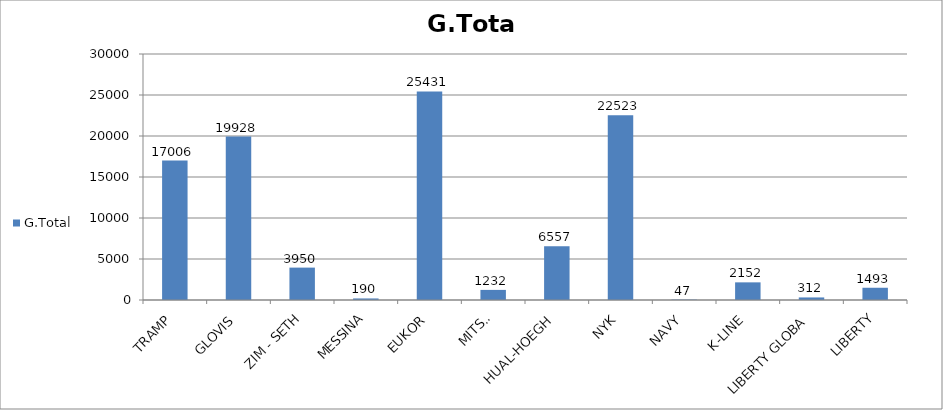
| Category | G.Total |
|---|---|
| TRAMP | 17006 |
| GLOVIS | 19928 |
| ZIM - SETH | 3950 |
| MESSINA | 190 |
| EUKOR | 25431 |
| MITSUI | 1232 |
| HUAL-HOEGH | 6557 |
| NYK | 22523 |
| NAVY | 47 |
| K-LINE | 2152 |
| LIBERTY GLOBA | 312 |
| LIBERTY | 1493 |